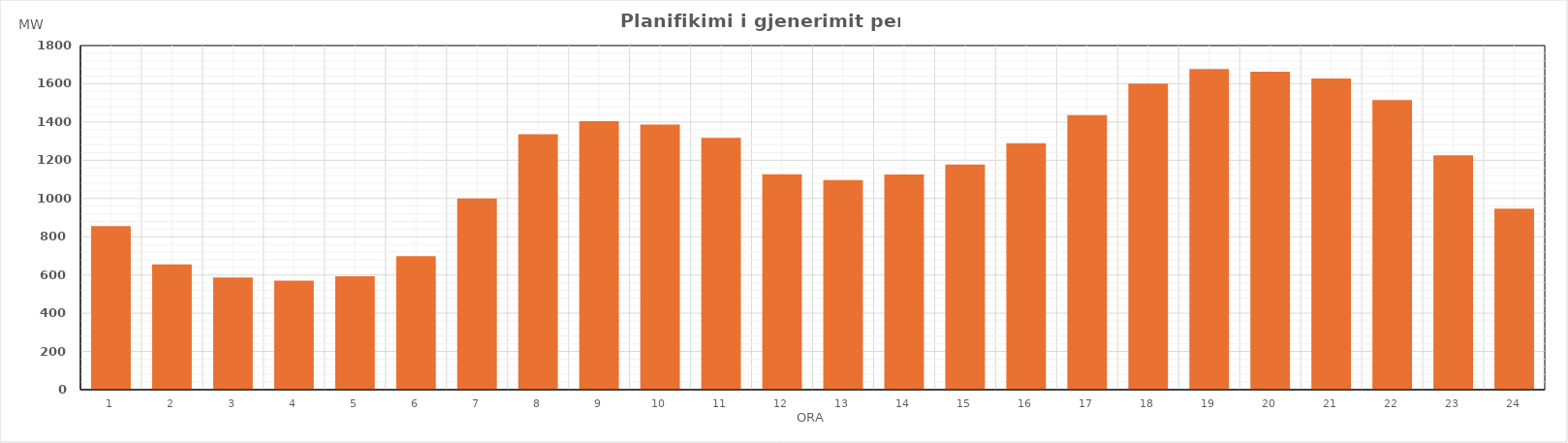
| Category | Max (MW) |
|---|---|
| 0 | 856.16 |
| 1 | 655.09 |
| 2 | 586.58 |
| 3 | 570.06 |
| 4 | 592.98 |
| 5 | 697.87 |
| 6 | 1000.28 |
| 7 | 1336.16 |
| 8 | 1403.91 |
| 9 | 1386.92 |
| 10 | 1317.62 |
| 11 | 1127.44 |
| 12 | 1095.87 |
| 13 | 1125.36 |
| 14 | 1177.89 |
| 15 | 1288.87 |
| 16 | 1436.24 |
| 17 | 1600.71 |
| 18 | 1677.33 |
| 19 | 1663.16 |
| 20 | 1628.06 |
| 21 | 1514.56 |
| 22 | 1226.09 |
| 23 | 946.68 |